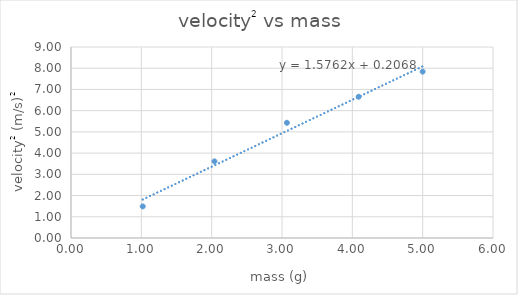
| Category | velocity^2 |
|---|---|
| 1.02 | 1.488 |
| 2.04 | 3.61 |
| 3.07 | 5.429 |
| 4.09 | 6.656 |
| 5.0 | 7.84 |